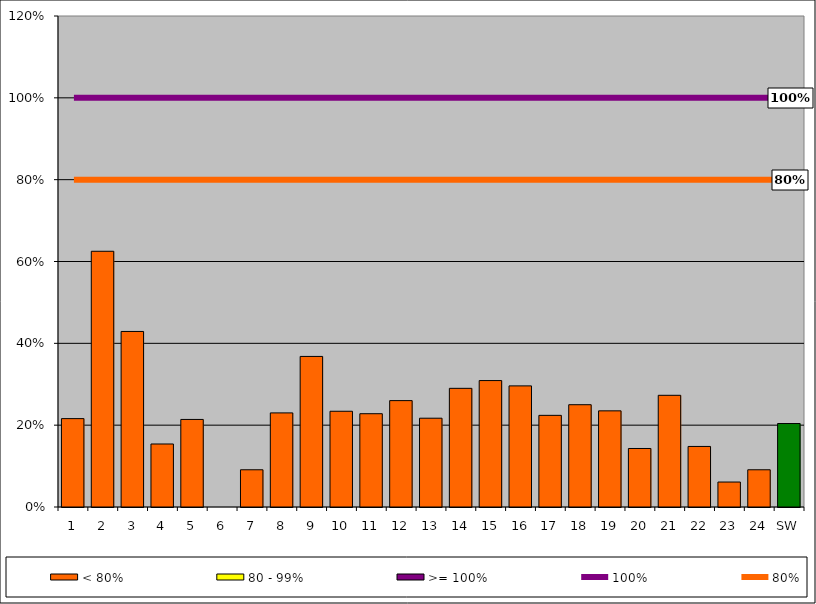
| Category | < 80% | 80 - 99% | >= 100% |
|---|---|---|---|
| 1 | 0.216 | 0 | 0 |
| 2 | 0.625 | 0 | 0 |
| 3 | 0.429 | 0 | 0 |
| 4 | 0.154 | 0 | 0 |
| 5 | 0.214 | 0 | 0 |
| 6 | 0 | 0 | 0 |
| 7 | 0.091 | 0 | 0 |
| 8 | 0.23 | 0 | 0 |
| 9 | 0.368 | 0 | 0 |
| 10 | 0.234 | 0 | 0 |
| 11 | 0.228 | 0 | 0 |
| 12 | 0.26 | 0 | 0 |
| 13 | 0.217 | 0 | 0 |
| 14 | 0.29 | 0 | 0 |
| 15 | 0.309 | 0 | 0 |
| 16 | 0.296 | 0 | 0 |
| 17 | 0.224 | 0 | 0 |
| 18 | 0.25 | 0 | 0 |
| 19 | 0.235 | 0 | 0 |
| 20 | 0.143 | 0 | 0 |
| 21 | 0.273 | 0 | 0 |
| 22 | 0.148 | 0 | 0 |
| 23 | 0.061 | 0 | 0 |
| 24 | 0.091 | 0 | 0 |
| SW | 0.204 | 0 | 0 |